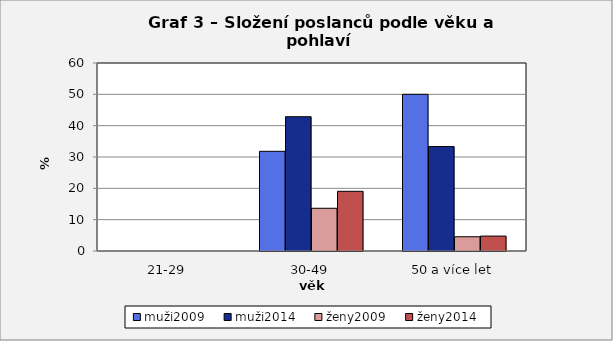
| Category | muži2009 | muži2014 | ženy2009 | ženy2014 |
|---|---|---|---|---|
| 21-29 | 0 | 0 | 0 | 0 |
| 30-49 | 31.818 | 42.86 | 13.636 | 19.05 |
| 50 a více let | 50 | 33.33 | 4.545 | 4.76 |